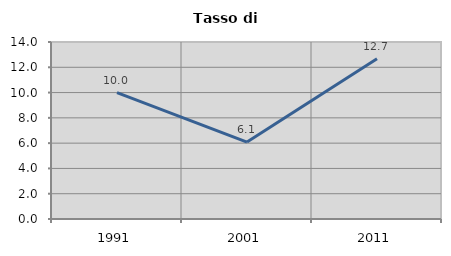
| Category | Tasso di disoccupazione   |
|---|---|
| 1991.0 | 10 |
| 2001.0 | 6.087 |
| 2011.0 | 12.676 |